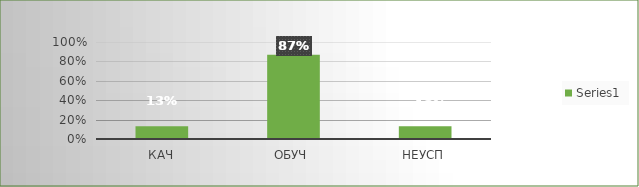
| Category | Series 0 |
|---|---|
| кач | 0.13 |
| обуч | 0.87 |
| неусп | 0.13 |